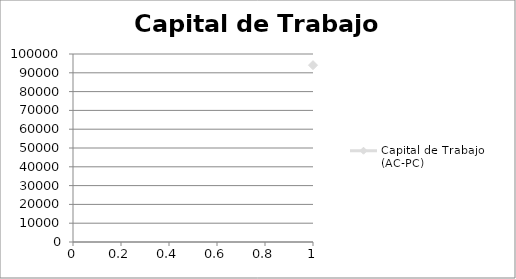
| Category | Capital de Trabajo (AC-PC) |
|---|---|
| 0 | 94050.272 |
| 1 | 70016.303 |
| 2 | 91597.302 |
| 3 | 87783.788 |
| 4 | 92016.625 |
| 5 | 93800.809 |
| 6 | 92347.235 |
| 7 | 89886.283 |